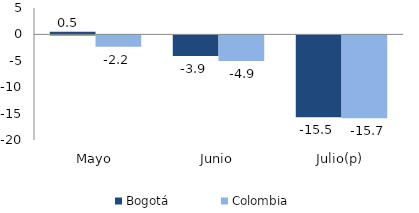
| Category | Bogotá | Colombia |
|---|---|---|
| Mayo | 0.508 | -2.152 |
| Junio | -3.892 | -4.863 |
| Julio(p) | -15.492 | -15.708 |